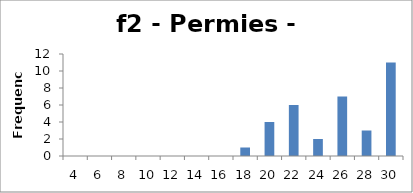
| Category | Frequency |
|---|---|
| 4.0 | 0 |
| 6.0 | 0 |
| 8.0 | 0 |
| 10.0 | 0 |
| 12.0 | 0 |
| 14.0 | 0 |
| 16.0 | 0 |
| 18.0 | 1 |
| 20.0 | 4 |
| 22.0 | 6 |
| 24.0 | 2 |
| 26.0 | 7 |
| 28.0 | 3 |
| 30.0 | 11 |